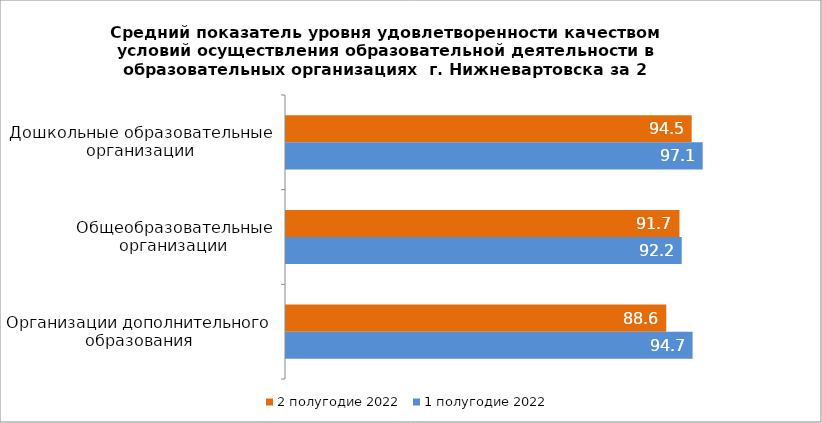
| Category | 2 полугодие 2022 | 1 полугодие 2022 |
|---|---|---|
| Дошкольные образовательные организации | 94.525 | 97.094 |
| Общеобразовательные организации | 91.682 | 92.202 |
| Организации дополнительного образования | 88.6 | 94.74 |